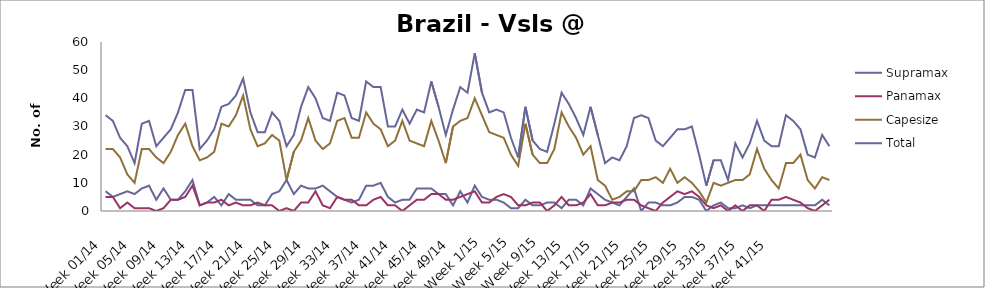
| Category | Supramax | Panamax | Capesize | Total |
|---|---|---|---|---|
| Week 01/14 | 7 | 5 | 22 | 34 |
| Week 02/14 | 5 | 5 | 22 | 32 |
| Week 03/14 | 6 | 1 | 19 | 26 |
| Week 04/14 | 7 | 3 | 13 | 23 |
| Week 05/14 | 6 | 1 | 10 | 17 |
| Week 06/14 | 8 | 1 | 22 | 31 |
| Week 07/14 | 9 | 1 | 22 | 32 |
| Week 08/14 | 4 | 0 | 19 | 23 |
| Week 09/14 | 8 | 1 | 17 | 26 |
| Week 10/14 | 4 | 4 | 21 | 29 |
| Week 11/14 | 4 | 4 | 27 | 35 |
| Week 12/14 | 7 | 5 | 31 | 43 |
| Week 13/14 | 11 | 9 | 23 | 43 |
| Week 14/14 | 2 | 2 | 18 | 22 |
| Week 15/14 | 3 | 3 | 19 | 25 |
| Week 16/14 | 5 | 3 | 21 | 29 |
| Week 17/14 | 2 | 4 | 31 | 37 |
| Week 18/14 | 6 | 2 | 30 | 38 |
| Week 19/14 | 4 | 3 | 34 | 41 |
| Week 20/14 | 4 | 2 | 41 | 47 |
| Week 21/14 | 4 | 2 | 29 | 35 |
| Week 22/14 | 2 | 3 | 23 | 28 |
| Week 23/14 | 2 | 2 | 24 | 28 |
| Week 24/14 | 6 | 2 | 27 | 35 |
| Week 25/14 | 7 | 0 | 25 | 32 |
| Week 26/14 | 11 | 1 | 11 | 23 |
| Week 27/14 | 6 | 0 | 21 | 27 |
| Week 28/14 | 9 | 3 | 25 | 37 |
| Week 29/14 | 8 | 3 | 33 | 44 |
| Week 30/14 | 8 | 7 | 25 | 40 |
| Week 31/14 | 9 | 2 | 22 | 33 |
| Week 32/14 | 7 | 1 | 24 | 32 |
| Week 33/14 | 5 | 5 | 32 | 42 |
| Week 34/14 | 4 | 4 | 33 | 41 |
| Week 35/14 | 3 | 4 | 26 | 33 |
| Week 36/14 | 4 | 2 | 26 | 32 |
| Week 37/14 | 9 | 2 | 35 | 46 |
| Week 38/14 | 9 | 4 | 31 | 44 |
| Week 39/14 | 10 | 5 | 29 | 44 |
| Week 40/14 | 5 | 2 | 23 | 30 |
| Week 41/14 | 3 | 2 | 25 | 30 |
| Week 42/14 | 4 | 0 | 32 | 36 |
| Week 43/14 | 4 | 2 | 25 | 31 |
| Week 44/14 | 8 | 4 | 24 | 36 |
| Week 45/14 | 8 | 4 | 23 | 35 |
| Week 46/14 | 8 | 6 | 32 | 46 |
| Week 47/14 | 6 | 6 | 25 | 37 |
| Week 48/14 | 6 | 4 | 17 | 27 |
| Week 49/14 | 2 | 4 | 30 | 36 |
| Week 50/14 | 7 | 5 | 32 | 44 |
| Week 51/14 | 3 | 6 | 33 | 42 |
| Week 52/14 | 9 | 7 | 40 | 56 |
| Week 1/15 | 5 | 3 | 34 | 42 |
| Week 2/15 | 4 | 3 | 28 | 35 |
| Week 3/15 | 4 | 5 | 27 | 36 |
| Week 4/15 | 3 | 6 | 26 | 35 |
| Week 5/15 | 1 | 5 | 20 | 26 |
| Week 6/15 | 1 | 2 | 16 | 19 |
| Week 7/15 | 4 | 2 | 31 | 37 |
| Week 8/15 | 2 | 3 | 20 | 25 |
| Week 9/15 | 2 | 3 | 17 | 22 |
| Week 10/15 | 3 | 0 | 17 | 21 |
| Week 11/15 | 3 | 2 | 22 | 31 |
| Week 12/15 | 1 | 5 | 35 | 42 |
| Week 13/15 | 4 | 2 | 30 | 38 |
| Week 14/15 | 4 | 2 | 26 | 33 |
| Week 15/15 | 2 | 3 | 20 | 27 |
| Week 16/15 | 8 | 6 | 23 | 37 |
| Week 17/15 | 6 | 2 | 11 | 27 |
| Week 18/15 | 4 | 2 | 9 | 17 |
| Week 19/15 | 3 | 3 | 4 | 19 |
| Week 20/15 | 2 | 3 | 5 | 18 |
| Week 21/15 | 5 | 4 | 7 | 23 |
| Week 22/15 | 8 | 4 | 7 | 33 |
| Week 23/15 | 0 | 2 | 11 | 34 |
| Week 24/15 | 3 | 1 | 11 | 33 |
| Week 25/15 | 3 | 0 | 12 | 25 |
| Week 26/15 | 2 | 3 | 10 | 23 |
| Week 27/15 | 2 | 5 | 15 | 26 |
| Week 28/15 | 3 | 7 | 10 | 29 |
| Week 29/15 | 5 | 6 | 12 | 29 |
| Week 30/15 | 5 | 7 | 10 | 30 |
| Week 31/15 | 4 | 5 | 7 | 20 |
| Week 32/15 | 0 | 2 | 3 | 9 |
| Week 33/15 | 2 | 1 | 10 | 18 |
| Week 34/15 | 3 | 2 | 9 | 18 |
| Week 35/15 | 1 | 0 | 10 | 11 |
| Week 36/15 | 1 | 2 | 11 | 24 |
| Week 37/15 | 2 | 0 | 11 | 19 |
| Week 38/15 | 1 | 2 | 13 | 24 |
| Week 39/15 | 2 | 2 | 22 | 32 |
| Week 40/15 | 2 | 0 | 15 | 25 |
| Week 41/15 | 2 | 4 | 11 | 23 |
| Week 42/15 | 2 | 4 | 8 | 23 |